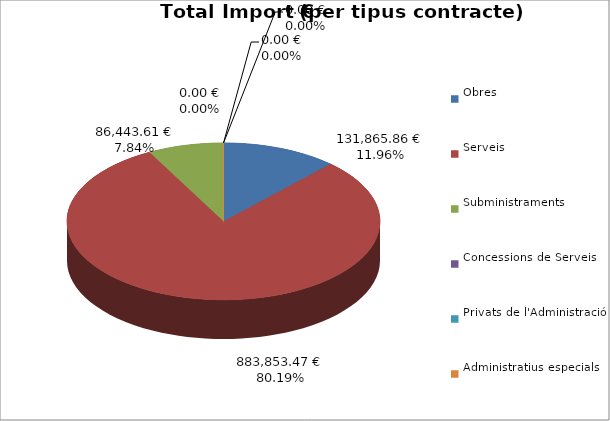
| Category | Total preu
(amb IVA) |
|---|---|
| Obres | 131865.86 |
| Serveis | 883853.47 |
| Subministraments | 86443.61 |
| Concessions de Serveis | 0 |
| Privats de l'Administració | 0 |
| Administratius especials | 0 |